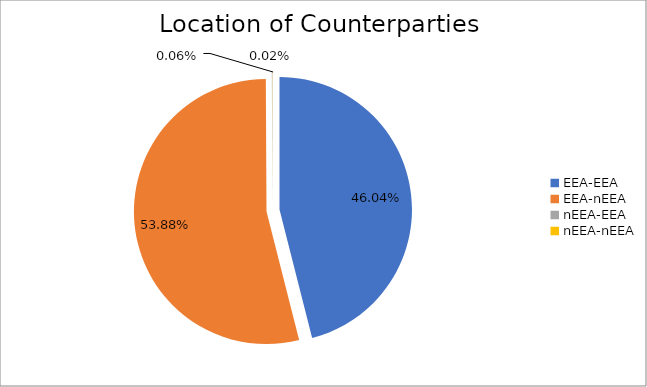
| Category | Series 0 |
|---|---|
| EEA-EEA | 5258003.001 |
| EEA-nEEA | 6153685.463 |
| nEEA-EEA | 7380.477 |
| nEEA-nEEA | 1955.207 |